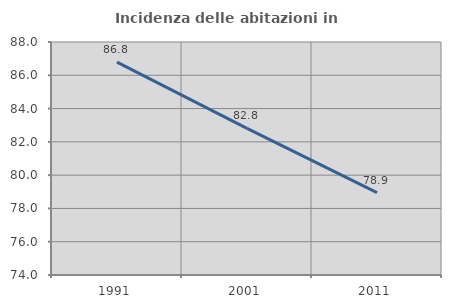
| Category | Incidenza delle abitazioni in proprietà  |
|---|---|
| 1991.0 | 86.792 |
| 2001.0 | 82.812 |
| 2011.0 | 78.947 |